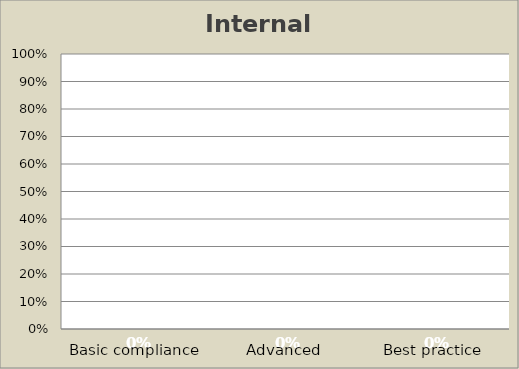
| Category | Internal Capacities |
|---|---|
| Basic compliance | 0 |
| Advanced | 0 |
| Best practice | 0 |